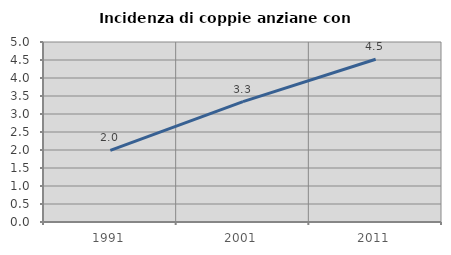
| Category | Incidenza di coppie anziane con figli |
|---|---|
| 1991.0 | 1.991 |
| 2001.0 | 3.345 |
| 2011.0 | 4.521 |